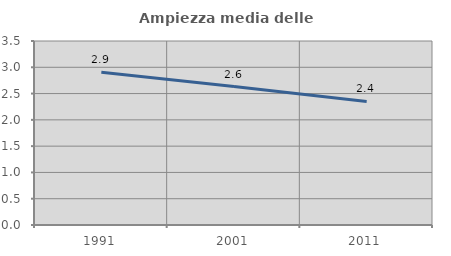
| Category | Ampiezza media delle famiglie |
|---|---|
| 1991.0 | 2.905 |
| 2001.0 | 2.634 |
| 2011.0 | 2.351 |